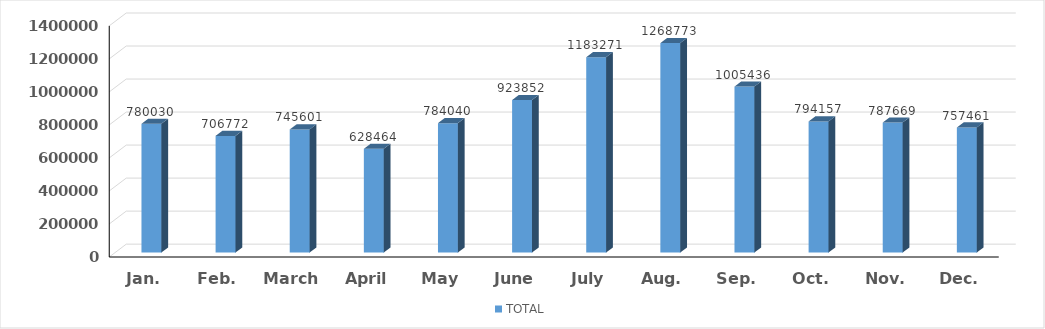
| Category | TOTAL |
|---|---|
| Jan. | 780030 |
| Feb. | 706772 |
| March | 745601 |
| April | 628464 |
| May | 784040 |
| June | 923852 |
| July | 1183271 |
| Aug. | 1268773 |
| Sep. | 1005436 |
| Oct. | 794157 |
| Nov. | 787669 |
| Dec. | 757461 |